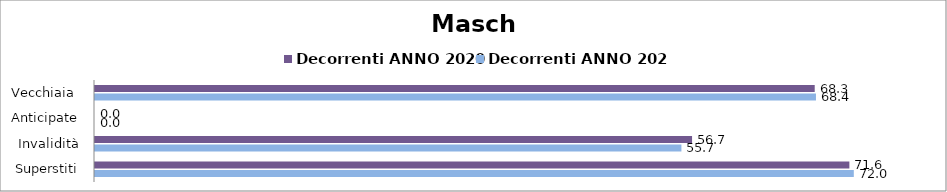
| Category | Decorrenti ANNO 2020 | Decorrenti ANNO 2021 |
|---|---|---|
| Vecchiaia  | 68.3 | 68.42 |
| Anticipate | 0 | 0 |
| Invalidità | 56.66 | 55.65 |
| Superstiti | 71.59 | 72.01 |